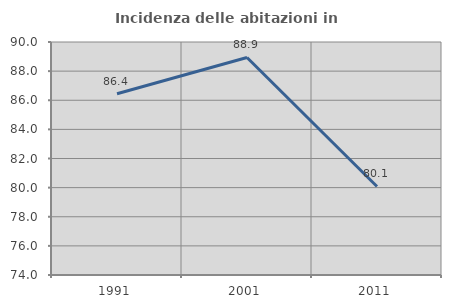
| Category | Incidenza delle abitazioni in proprietà  |
|---|---|
| 1991.0 | 86.449 |
| 2001.0 | 88.936 |
| 2011.0 | 80.08 |